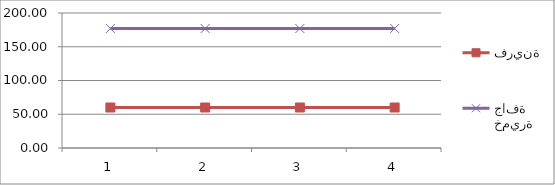
| Category | فرينة | خميرة جافة |
|---|---|---|
| 0 | 60 | 177 |
| 1 | 60 | 177 |
| 2 | 60 | 177 |
| 3 | 60 | 177 |